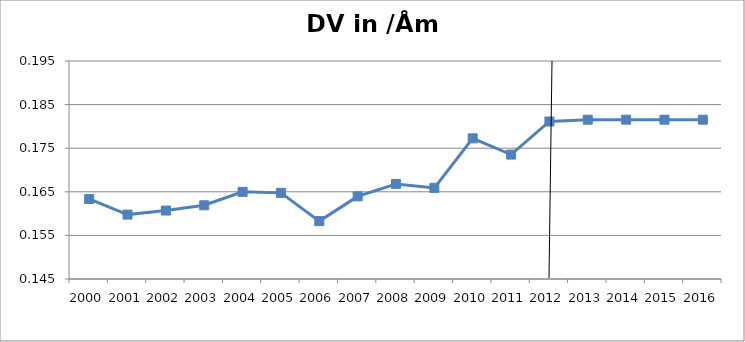
| Category | DV in /Åm in |
|---|---|
| 2000.0 | 0.163 |
| 2001.0 | 0.16 |
| 2002.0 | 0.161 |
| 2003.0 | 0.162 |
| 2004.0 | 0.165 |
| 2005.0 | 0.165 |
| 2006.0 | 0.158 |
| 2007.0 | 0.164 |
| 2008.0 | 0.167 |
| 2009.0 | 0.166 |
| 2010.0 | 0.177 |
| 2011.0 | 0.174 |
| 2012.0 | 0.181 |
| 2013.0 | 0.182 |
| 2014.0 | 0.182 |
| 2015.0 | 0.182 |
| 2016.0 | 0.182 |